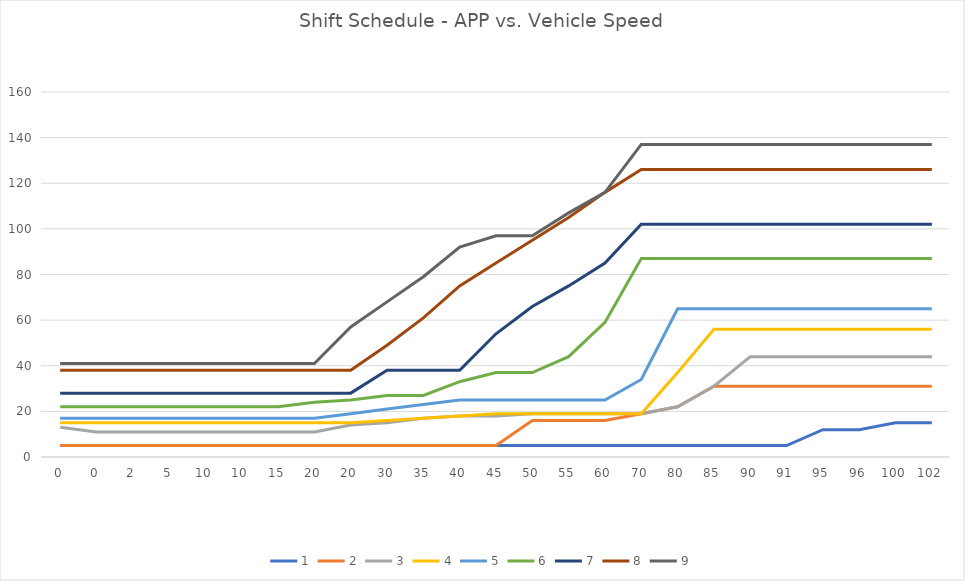
| Category | 1 | 2 | 3 | 4 | 5 | 6 | 7 | 8 | 9 |
|---|---|---|---|---|---|---|---|---|---|
| 0.0 | 5 | 5 | 13 | 15 | 17 | 22 | 28 | 38 | 41 |
| 0.0 | 5 | 5 | 11 | 15 | 17 | 22 | 28 | 38 | 41 |
| 2.0 | 5 | 5 | 11 | 15 | 17 | 22 | 28 | 38 | 41 |
| 5.0 | 5 | 5 | 11 | 15 | 17 | 22 | 28 | 38 | 41 |
| 10.0 | 5 | 5 | 11 | 15 | 17 | 22 | 28 | 38 | 41 |
| 10.0 | 5 | 5 | 11 | 15 | 17 | 22 | 28 | 38 | 41 |
| 15.0 | 5 | 5 | 11 | 15 | 17 | 22 | 28 | 38 | 41 |
| 20.0 | 5 | 5 | 11 | 15 | 17 | 24 | 28 | 38 | 41 |
| 20.0 | 5 | 5 | 14 | 15 | 19 | 25 | 28 | 38 | 57 |
| 30.0 | 5 | 5 | 15 | 16 | 21 | 27 | 38 | 49 | 68 |
| 35.0 | 5 | 5 | 17 | 17 | 23 | 27 | 38 | 61 | 79 |
| 40.0 | 5 | 5 | 18 | 18 | 25 | 33 | 38 | 75 | 92 |
| 45.0 | 5 | 5 | 18 | 19 | 25 | 37 | 54 | 85 | 97 |
| 50.0 | 5 | 16 | 19 | 19 | 25 | 37 | 66 | 95 | 97 |
| 55.0 | 5 | 16 | 19 | 19 | 25 | 44 | 75 | 105 | 107 |
| 60.0 | 5 | 16 | 19 | 19 | 25 | 59 | 85 | 116 | 116 |
| 70.0 | 5 | 19 | 19 | 19 | 34 | 87 | 102 | 126 | 137 |
| 80.0 | 5 | 22 | 22 | 37 | 65 | 87 | 102 | 126 | 137 |
| 85.0 | 5 | 31 | 31 | 56 | 65 | 87 | 102 | 126 | 137 |
| 90.0 | 5 | 31 | 44 | 56 | 65 | 87 | 102 | 126 | 137 |
| 91.0 | 5 | 31 | 44 | 56 | 65 | 87 | 102 | 126 | 137 |
| 95.0 | 12 | 31 | 44 | 56 | 65 | 87 | 102 | 126 | 137 |
| 96.0 | 12 | 31 | 44 | 56 | 65 | 87 | 102 | 126 | 137 |
| 100.0 | 15 | 31 | 44 | 56 | 65 | 87 | 102 | 126 | 137 |
| 102.0 | 15 | 31 | 44 | 56 | 65 | 87 | 102 | 126 | 137 |